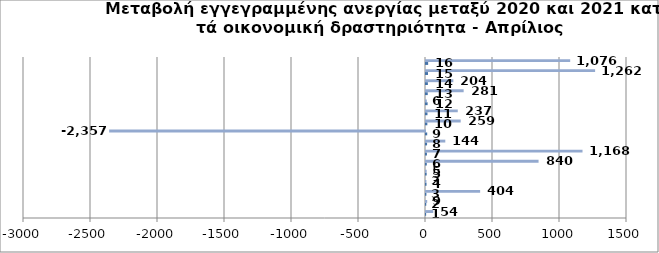
| Category | Series 0 | Series 1 |
|---|---|---|
| 0 | 1 | 54 |
| 1 | 2 | 9 |
| 2 | 3 | 404 |
| 3 | 4 | 3 |
| 4 | 5 | 5 |
| 5 | 6 | 840 |
| 6 | 7 | 1168 |
| 7 | 8 | 144 |
| 8 | 9 | -2357 |
| 9 | 10 | 259 |
| 10 | 11 | 237 |
| 11 | 12 | 6 |
| 12 | 13 | 281 |
| 13 | 14 | 204 |
| 14 | 15 | 1262 |
| 15 | 16 | 1076 |